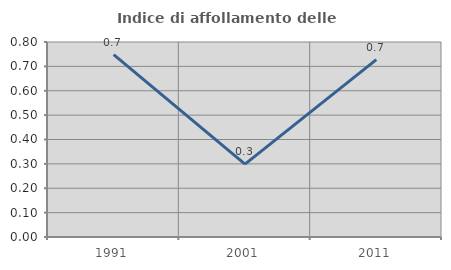
| Category | Indice di affollamento delle abitazioni  |
|---|---|
| 1991.0 | 0.748 |
| 2001.0 | 0.299 |
| 2011.0 | 0.728 |